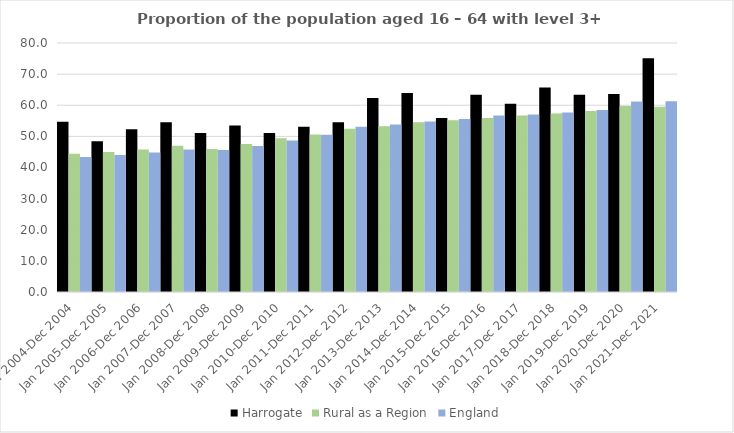
| Category | Harrogate | Rural as a Region | England |
|---|---|---|---|
| Jan 2004-Dec 2004 | 54.7 | 44.405 | 43.4 |
| Jan 2005-Dec 2005 | 48.4 | 44.973 | 44 |
| Jan 2006-Dec 2006 | 52.3 | 45.774 | 44.8 |
| Jan 2007-Dec 2007 | 54.5 | 46.968 | 45.8 |
| Jan 2008-Dec 2008 | 51.1 | 45.964 | 45.6 |
| Jan 2009-Dec 2009 | 53.5 | 47.59 | 46.9 |
| Jan 2010-Dec 2010 | 51.1 | 49.362 | 48.7 |
| Jan 2011-Dec 2011 | 53.1 | 50.602 | 50.5 |
| Jan 2012-Dec 2012 | 54.5 | 52.439 | 53.1 |
| Jan 2013-Dec 2013 | 62.3 | 53.276 | 53.8 |
| Jan 2014-Dec 2014 | 63.9 | 54.57 | 54.8 |
| Jan 2015-Dec 2015 | 55.9 | 55.16 | 55.6 |
| Jan 2016-Dec 2016 | 63.4 | 55.941 | 56.7 |
| Jan 2017-Dec 2017 | 60.5 | 56.689 | 57 |
| Jan 2018-Dec 2018 | 65.7 | 57.389 | 57.7 |
| Jan 2019-Dec 2019 | 63.4 | 58.147 | 58.5 |
| Jan 2020-Dec 2020 | 63.6 | 59.771 | 61.2 |
| Jan 2021-Dec 2021 | 75.1 | 59.54 | 61.3 |